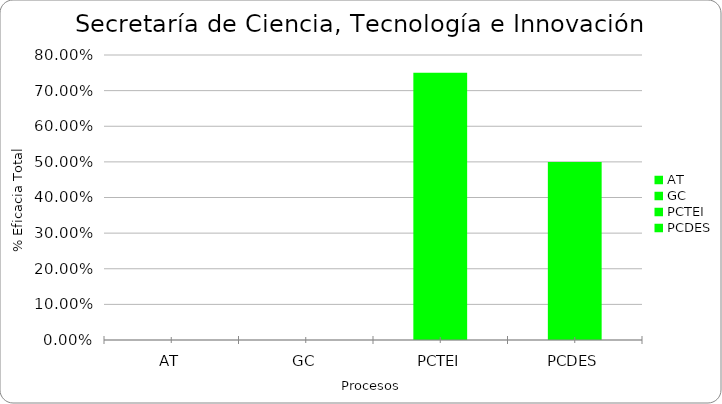
| Category | % Eficacia total |
|---|---|
| AT | 0 |
| GC | 0 |
| PCTEI | 0.75 |
| PCDES | 0.5 |